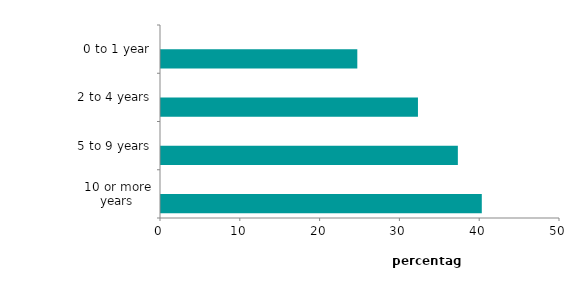
| Category | Series 0 | Series 1 |
|---|---|---|
| 10 or more years | 40.2 |  |
| 5 to 9 years | 37.2 |  |
| 2 to 4 years | 32.2 |  |
| 0 to 1 year | 24.6 |  |